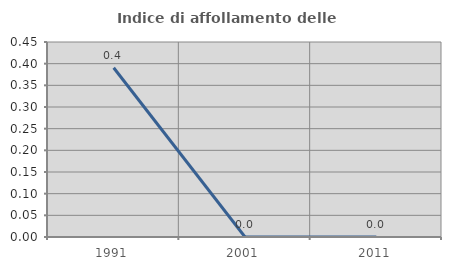
| Category | Indice di affollamento delle abitazioni  |
|---|---|
| 1991.0 | 0.391 |
| 2001.0 | 0 |
| 2011.0 | 0 |